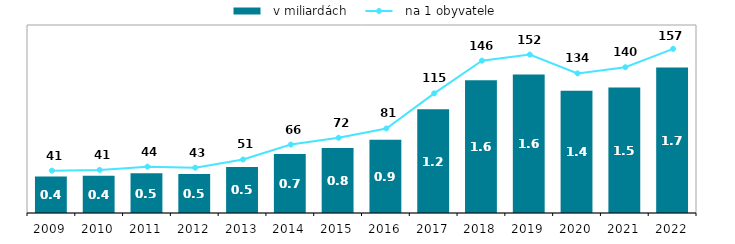
| Category |   v miliardách |
|---|---|
| 2009.0 | 0.426 |
| 2010.0 | 0.435 |
| 2011.0 | 0.466 |
| 2012.0 | 0.456 |
| 2013.0 | 0.539 |
| 2014.0 | 0.69 |
| 2015.0 | 0.76 |
| 2016.0 | 0.856 |
| 2017.0 | 1.215 |
| 2018.0 | 1.553 |
| 2019.0 | 1.622 |
| 2020.0 | 1.43 |
| 2021.0 | 1.468 |
| 2022.0 | 1.701 |